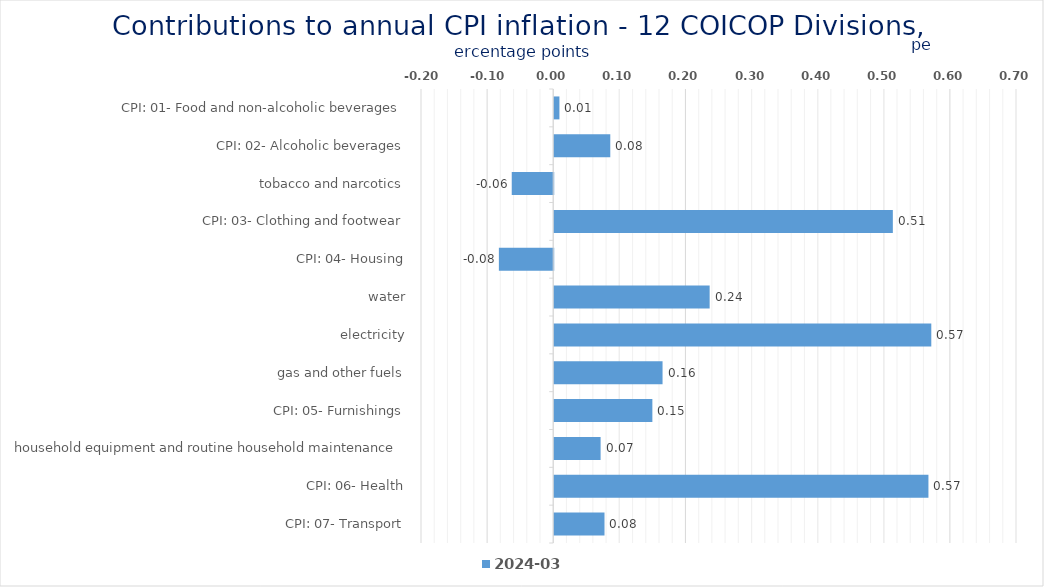
| Category | 2024-03 |
|---|---|
| CPI: 01- Food and non-alcoholic beverages | 0.008 |
| CPI: 02- Alcoholic beverages, tobacco and narcotics | 0.085 |
| CPI: 03- Clothing and footwear | -0.063 |
| CPI: 04- Housing, water, electricity, gas and other fuels | 0.512 |
| CPI: 05- Furnishings, household equipment and routine household maintenance | -0.082 |
| CPI: 06- Health | 0.235 |
| CPI: 07- Transport | 0.57 |
| CPI: 08- Communication | 0.164 |
| CPI: 09- Recreation and culture | 0.148 |
| CPI: 10- Education | 0.07 |
| CPI: 11- Restaurants and hotels | 0.566 |
| CPI: 12- Miscellaneous goods and services | 0.076 |